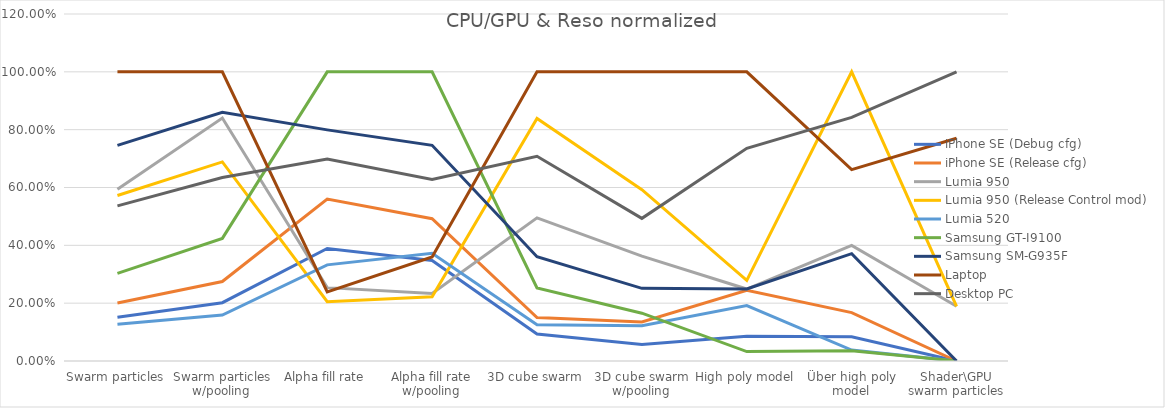
| Category | iPhone SE (Debug cfg) | iPhone SE (Release cfg) | Lumia 950 | Lumia 950 (Release Control mod) | Lumia 520 | Samsung GT-I9100 | Samsung SM-G935F | Laptop | Desktop PC |
|---|---|---|---|---|---|---|---|---|---|
| Swarm particles | 0.151 | 0.2 | 0.594 | 0.572 | 0.127 | 0.303 | 0.746 | 1 | 0.536 |
| Swarm particles w/pooling | 0.202 | 0.275 | 0.84 | 0.688 | 0.159 | 0.424 | 0.86 | 1 | 0.634 |
| Alpha fill rate | 0.389 | 0.56 | 0.254 | 0.205 | 0.332 | 1 | 0.799 | 0.239 | 0.698 |
| Alpha fill rate w/pooling | 0.347 | 0.492 | 0.234 | 0.222 | 0.372 | 1 | 0.746 | 0.36 | 0.628 |
| 3D cube swarm | 0.093 | 0.15 | 0.495 | 0.839 | 0.125 | 0.253 | 0.36 | 1 | 0.708 |
| 3D cube swarm w/pooling | 0.057 | 0.135 | 0.362 | 0.593 | 0.122 | 0.165 | 0.251 | 1 | 0.493 |
| High poly model | 0.085 | 0.245 | 0.249 | 0.278 | 0.192 | 0.033 | 0.249 | 1 | 0.736 |
| Über high poly model | 0.084 | 0.167 | 0.4 | 1 | 0.038 | 0.036 | 0.371 | 0.662 | 0.843 |
| Shader\GPU swarm particles | 0 | 0 | 0.189 | 0.189 | 0 | 0 | 0 | 0.771 | 1 |